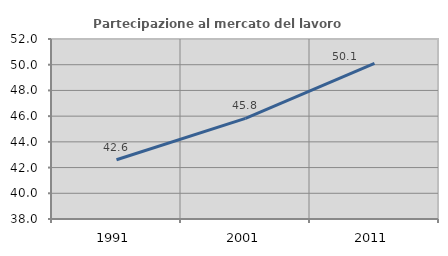
| Category | Partecipazione al mercato del lavoro  femminile |
|---|---|
| 1991.0 | 42.61 |
| 2001.0 | 45.825 |
| 2011.0 | 50.105 |